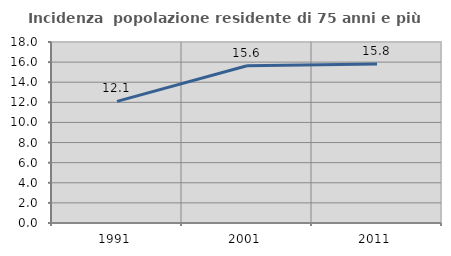
| Category | Incidenza  popolazione residente di 75 anni e più |
|---|---|
| 1991.0 | 12.091 |
| 2001.0 | 15.639 |
| 2011.0 | 15.821 |